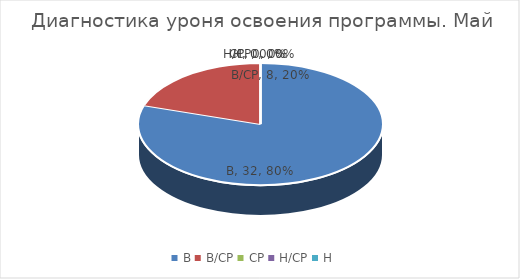
| Category | Золотая рыбка |
|---|---|
| В | 32 |
| В/СР | 8 |
| СР | 0 |
| Н/СР | 0 |
| Н | 0 |